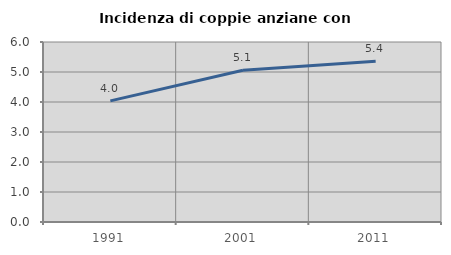
| Category | Incidenza di coppie anziane con figli |
|---|---|
| 1991.0 | 4.038 |
| 2001.0 | 5.059 |
| 2011.0 | 5.359 |